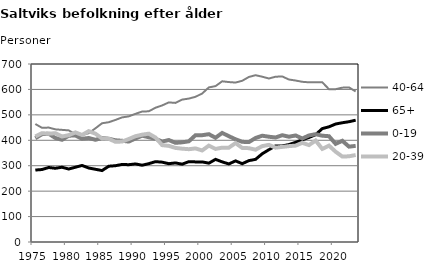
| Category | 40-64 | 65+ | 0-19 | 20-39 |
|---|---|---|---|---|
| 1975.0 | 464 | 283 | 408 | 415 |
| 1976.0 | 449 | 285 | 424 | 428 |
| 1977.0 | 450 | 293 | 426 | 426 |
| 1978.0 | 443 | 290 | 409 | 428 |
| 1979.0 | 441 | 294 | 402 | 415 |
| 1980.0 | 439 | 287 | 418 | 420 |
| 1981.0 | 424 | 294 | 419 | 431 |
| 1982.0 | 420 | 301 | 406 | 421 |
| 1983.0 | 428 | 291 | 409 | 436 |
| 1984.0 | 447 | 286 | 402 | 426 |
| 1985.0 | 467 | 281 | 409 | 407 |
| 1986.0 | 471 | 298 | 406 | 406 |
| 1987.0 | 480 | 300 | 400 | 394 |
| 1988.0 | 490 | 305 | 398 | 395 |
| 1989.0 | 494 | 304 | 395 | 405 |
| 1990.0 | 504 | 307 | 407 | 416 |
| 1991.0 | 513 | 302 | 418 | 422 |
| 1992.0 | 514 | 308 | 412 | 426 |
| 1993.0 | 528 | 316 | 406 | 411 |
| 1994.0 | 537 | 314 | 395 | 381 |
| 1995.0 | 549 | 308 | 401 | 378 |
| 1996.0 | 547 | 311 | 390 | 370 |
| 1997.0 | 560 | 306 | 392 | 367 |
| 1998.0 | 564 | 316 | 396 | 365 |
| 1999.0 | 571 | 315 | 420 | 368 |
| 2000.0 | 584 | 315 | 420 | 360 |
| 2001.0 | 608 | 310 | 424 | 379 |
| 2002.0 | 613 | 325 | 410 | 366 |
| 2003.0 | 632 | 315 | 429 | 371 |
| 2004.0 | 629 | 307 | 416 | 371 |
| 2005.0 | 627 | 319 | 404 | 389 |
| 2006.0 | 634 | 308 | 394 | 370 |
| 2007.0 | 649 | 320 | 393 | 369 |
| 2008.0 | 656 | 325 | 409 | 363 |
| 2009.0 | 650 | 347 | 418 | 377 |
| 2010.0 | 643 | 363 | 414 | 382 |
| 2011.0 | 650 | 378 | 411 | 371 |
| 2012.0 | 651 | 378 | 420 | 374 |
| 2013.0 | 639 | 383 | 414 | 377 |
| 2014.0 | 635 | 392 | 419 | 379 |
| 2015.0 | 630 | 402 | 407 | 390 |
| 2016.0 | 628 | 411 | 419 | 381 |
| 2017.0 | 628 | 422 | 424 | 399 |
| 2018.0 | 628 | 446 | 418 | 366 |
| 2019.0 | 601 | 453 | 416 | 379 |
| 2020.0 | 601 | 464 | 386 | 355 |
| 2021.0 | 607 | 469 | 398 | 336 |
| 2022.0 | 608 | 473 | 375 | 337 |
| 2023.0 | 592 | 479 | 378 | 342 |